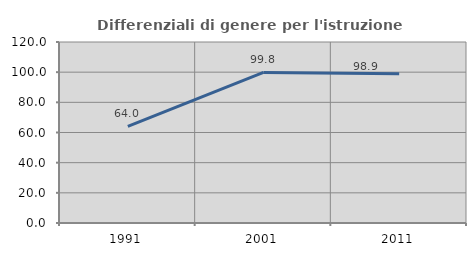
| Category | Differenziali di genere per l'istruzione superiore |
|---|---|
| 1991.0 | 64.001 |
| 2001.0 | 99.798 |
| 2011.0 | 98.87 |